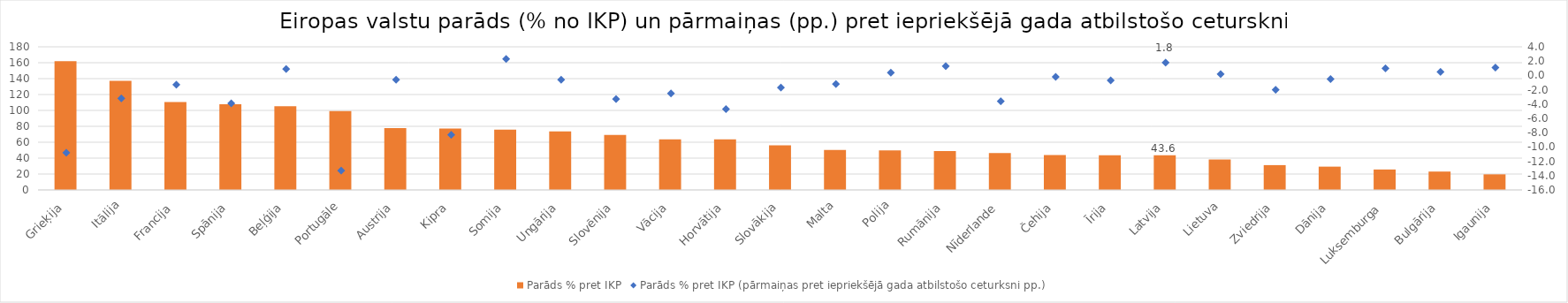
| Category | Parāds % pret IKP |
|---|---|
| Grieķija | 161.9 |
| Itālija | 137.3 |
| Francija | 110.6 |
| Spānija | 107.7 |
|  Beļģija | 105.2 |
| Portugāle | 99.1 |
| Austrija | 77.8 |
| Kipra | 77.3 |
| Somija | 75.8 |
| Ungārija | 73.5 |
| Slovēnija | 69.2 |
| Vācija | 63.6 |
| Horvātija | 63.5 |
| Slovākija | 56 |
| Malta | 50.4 |
| Polija | 49.6 |
| Rumānija | 48.8 |
| Nīderlande | 46.5 |
| Čehija | 44 |
| Īrija | 43.7 |
| Latvija | 43.6 |
| Lietuva | 38.3 |
| Zviedrija | 31.2 |
| Dānija | 29.3 |
| Luksemburga | 25.7 |
| Bulgārija | 23.1 |
| Igaunija | 19.6 |